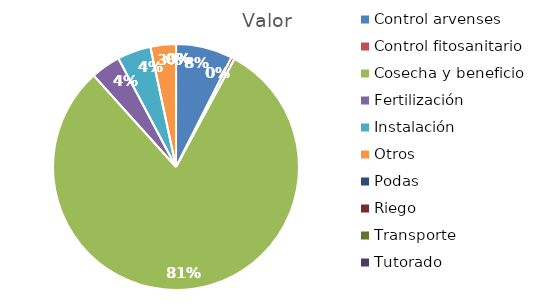
| Category | Valor |
|---|---|
| Control arvenses | 3771601 |
| Control fitosanitario | 218888 |
| Cosecha y beneficio | 40709570 |
| Fertilización | 1969992 |
| Instalación | 2232657 |
| Otros | 1696382 |
| Podas | 0 |
| Riego | 0 |
| Transporte | 0 |
| Tutorado | 0 |